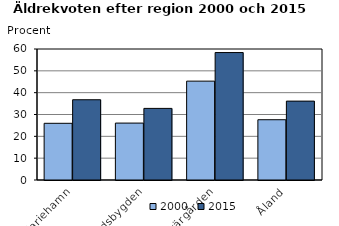
| Category | 2000 | 2015 |
|---|---|---|
| Mariehamn | 25.966 | 36.762 |
| Landsbygden | 26.071 | 32.792 |
| Skärgården | 45.282 | 58.37 |
| Åland | 27.61 | 36.129 |